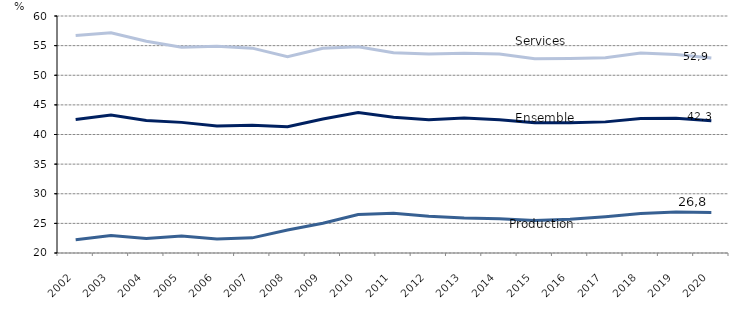
| Category | Production | Services | Ensemble |
|---|---|---|---|
| 2002.0 | 22.228 | 56.693 | 42.519 |
| 2003.0 | 22.943 | 57.171 | 43.282 |
| 2004.0 | 22.467 | 55.734 | 42.375 |
| 2005.0 | 22.871 | 54.735 | 42.047 |
| 2006.0 | 22.357 | 54.889 | 41.446 |
| 2007.0 | 22.554 | 54.571 | 41.581 |
| 2008.0 | 23.882 | 53.115 | 41.3 |
| 2009.0 | 25.031 | 54.538 | 42.606 |
| 2010.0 | 26.5 | 54.8 | 43.7 |
| 2011.0 | 26.7 | 53.8 | 42.9 |
| 2012.0 | 26.2 | 53.6 | 42.5 |
| 2013.0 | 25.9 | 53.7 | 42.8 |
| 2014.0 | 25.8 | 53.6 | 42.5 |
| 2015.0 | 25.5 | 52.8 | 42 |
| 2016.0 | 25.708 | 52.834 | 41.991 |
| 2017.0 | 26.127 | 52.949 | 42.131 |
| 2018.0 | 26.673 | 53.76 | 42.72 |
| 2019.0 | 26.906 | 53.506 | 42.753 |
| 2020.0 | 26.845 | 52.901 | 42.323 |